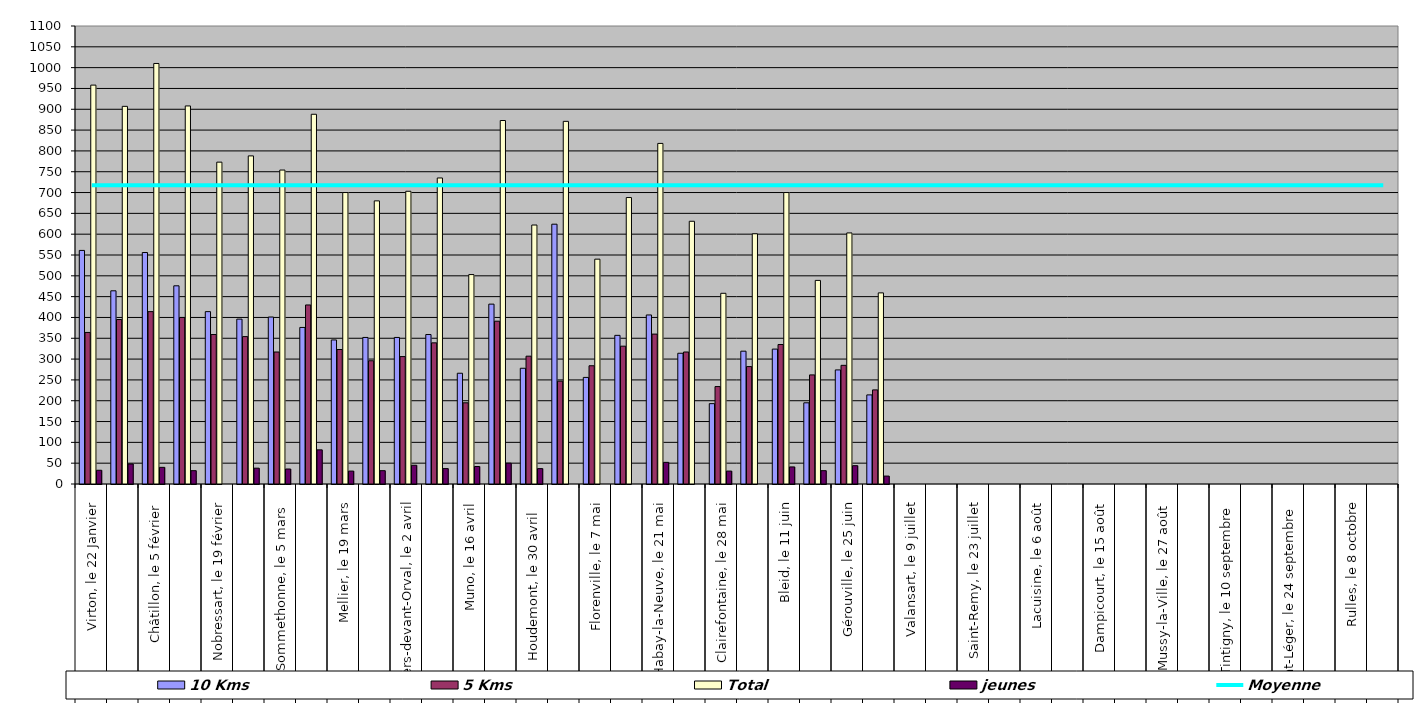
| Category | 10 Kms | 5 Kms | Total | jeunes |
|---|---|---|---|---|
| 0 | 561 | 364 | 958 | 33 |
| 1 | 464 | 395 | 907 | 48 |
| 2 | 556 | 414 | 1010 | 40 |
| 3 | 476 | 400 | 908 | 32 |
| 4 | 414 | 359 | 773 | 0 |
| 5 | 396 | 354 | 788 | 38 |
| 6 | 401 | 317 | 754 | 36 |
| 7 | 376 | 430 | 888 | 82 |
| 8 | 346 | 323 | 700 | 31 |
| 9 | 352 | 296 | 680 | 32 |
| 10 | 352 | 306 | 703 | 45 |
| 11 | 359 | 339 | 735 | 37 |
| 12 | 266 | 195 | 503 | 42 |
| 13 | 432 | 391 | 873 | 50 |
| 14 | 278 | 307 | 622 | 37 |
| 15 | 624 | 247 | 871 | 0 |
| 16 | 256 | 284 | 540 | 0 |
| 17 | 357 | 331 | 688 | 0 |
| 18 | 406 | 360 | 818 | 52 |
| 19 | 314 | 317 | 631 | 0 |
| 20 | 193 | 234 | 458 | 31 |
| 21 | 319 | 282 | 601 | 0 |
| 22 | 324 | 335 | 700 | 41 |
| 23 | 195 | 262 | 489 | 32 |
| 24 | 274 | 285 | 603 | 44 |
| 25 | 214 | 226 | 459 | 19 |
| 26 | 0 | 0 | 0 | 0 |
| 27 | 0 | 0 | 0 | 0 |
| 28 | 0 | 0 | 0 | 0 |
| 29 | 0 | 0 | 0 | 0 |
| 30 | 0 | 0 | 0 | 0 |
| 31 | 0 | 0 | 0 | 0 |
| 32 | 0 | 0 | 0 | 0 |
| 33 | 0 | 0 | 0 | 0 |
| 34 | 0 | 0 | 0 | 0 |
| 35 | 0 | 0 | 0 | 0 |
| 36 | 0 | 0 | 0 | 0 |
| 37 | 0 | 0 | 0 | 0 |
| 38 | 0 | 0 | 0 | 0 |
| 39 | 0 | 0 | 0 | 0 |
| 40 | 0 | 0 | 0 | 0 |
| 41 | 0 | 0 | 0 | 0 |